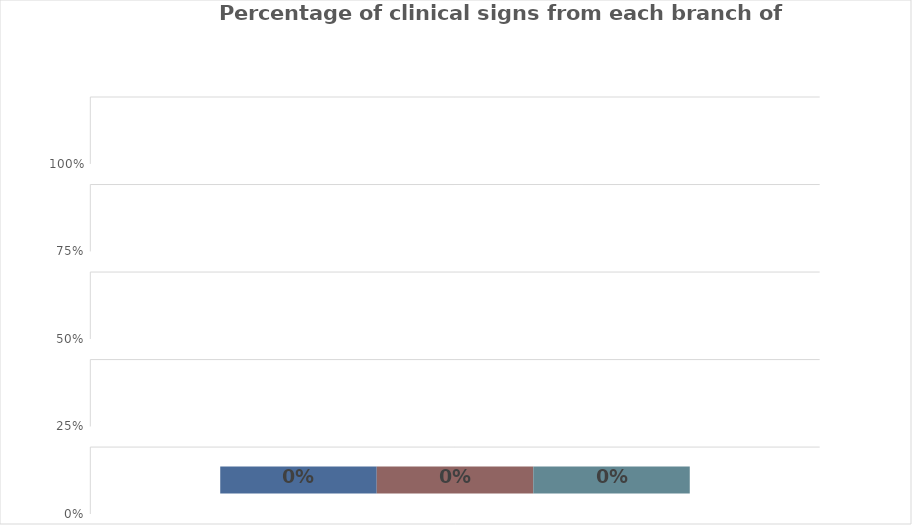
| Category | Series1 | Series2 | Series3 |
|---|---|---|---|
| 0 | 0 | 0 | 0 |